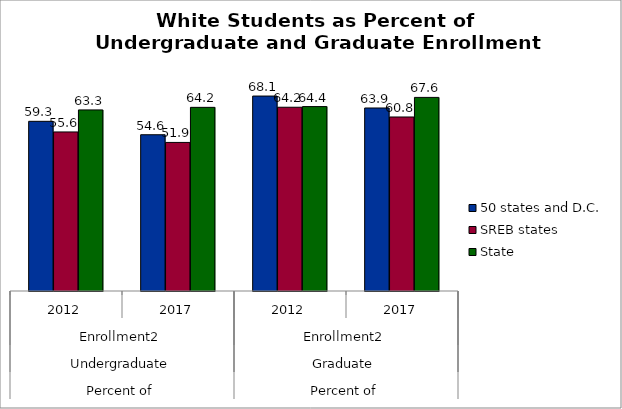
| Category | 50 states and D.C. | SREB states | State |
|---|---|---|---|
| 0 | 59.279 | 55.564 | 63.262 |
| 1 | 54.586 | 51.9 | 64.156 |
| 2 | 68.104 | 64.193 | 64.422 |
| 3 | 63.935 | 60.79 | 67.635 |